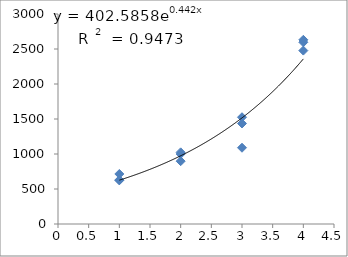
| Category | Series 0 |
|---|---|
| 1.0 | 714.659 |
| 1.0 | 623.067 |
| 1.0 | 629.093 |
| 2.0 | 1023.563 |
| 2.0 | 897.493 |
| 2.0 | 999.55 |
| 3.0 | 1089.399 |
| 3.0 | 1525.158 |
| 3.0 | 1436.026 |
| 4.0 | 2631.388 |
| 4.0 | 2477.237 |
| 4.0 | 2596.23 |